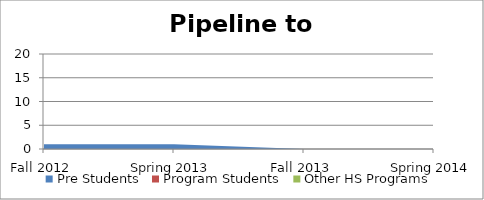
| Category | Pre Students | Program Students | Other HS Programs |
|---|---|---|---|
| Fall 2012 | 1 | 0 | 0 |
| Spring 2013 | 1 | 0 | 0 |
| Fall 2013 | 0 | 0 | 0 |
| Spring 2014 | 0 | 0 | 0 |